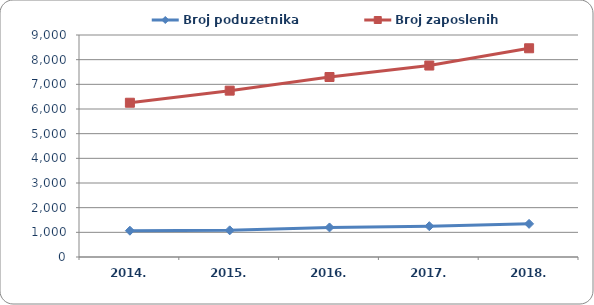
| Category | Broj poduzetnika  | Broj zaposlenih  |
|---|---|---|
| 2014. | 1066 | 6254 |
| 2015. | 1081 | 6744 |
| 2016. | 1198 | 7297 |
| 2017. | 1249 | 7762 |
| 2018. | 1343 | 8462 |